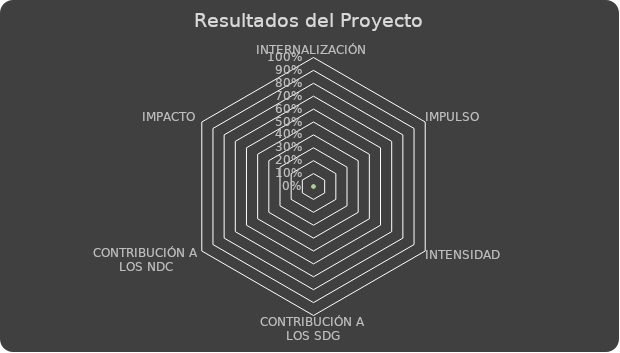
| Category | Series 0 |
|---|---|
| INTERNALIZACIÓN | 0 |
| IMPULSO | 0 |
| INTENSIDAD | 0 |
| CONTRIBUCIÓN A LOS SDG | 0 |
| CONTRIBUCIÓN A LOS NDC | 0 |
| IMPACTO | 0 |